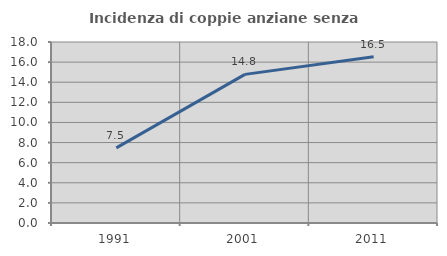
| Category | Incidenza di coppie anziane senza figli  |
|---|---|
| 1991.0 | 7.475 |
| 2001.0 | 14.781 |
| 2011.0 | 16.537 |